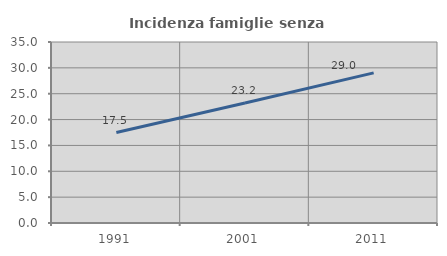
| Category | Incidenza famiglie senza nuclei |
|---|---|
| 1991.0 | 17.495 |
| 2001.0 | 23.21 |
| 2011.0 | 29.029 |